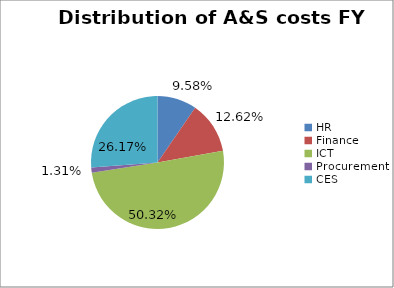
| Category | Distribution of A&S costs FY 2012/13 |
|---|---|
| HR | 0.096 |
| Finance | 0.126 |
| ICT | 0.503 |
| Procurement | 0.013 |
| CES | 0.262 |